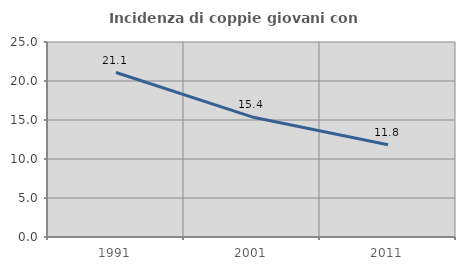
| Category | Incidenza di coppie giovani con figli |
|---|---|
| 1991.0 | 21.087 |
| 2001.0 | 15.396 |
| 2011.0 | 11.828 |